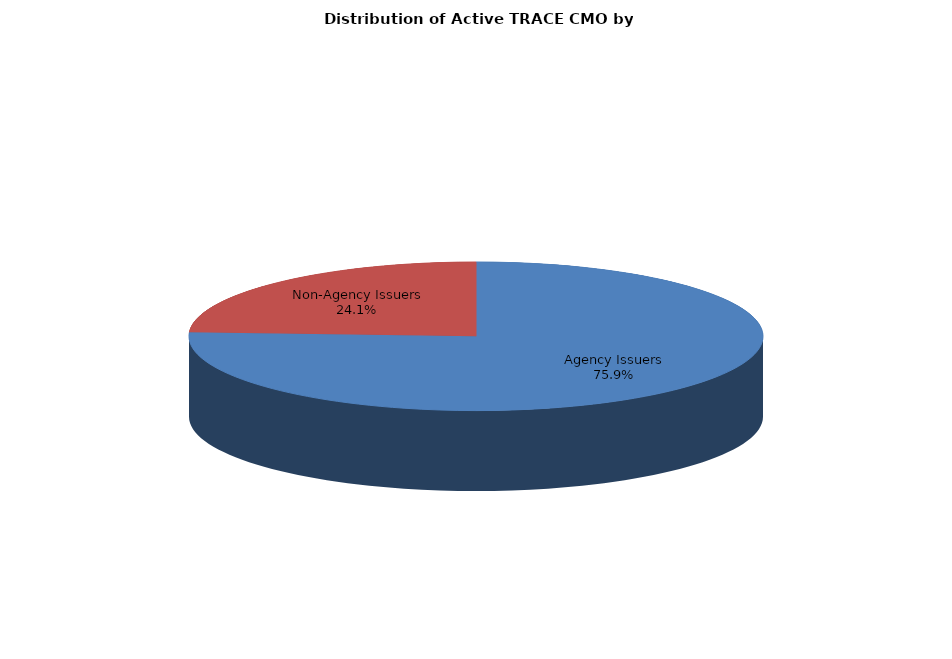
| Category | Series 0 |
|---|---|
| Agency Issuers | 253532 |
| Non-Agency Issuers | 80660 |